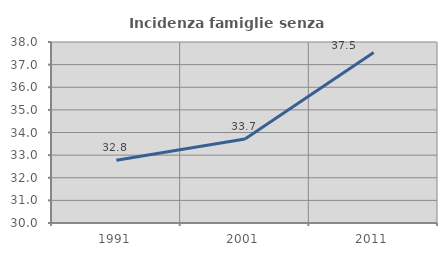
| Category | Incidenza famiglie senza nuclei |
|---|---|
| 1991.0 | 32.773 |
| 2001.0 | 33.715 |
| 2011.0 | 37.532 |